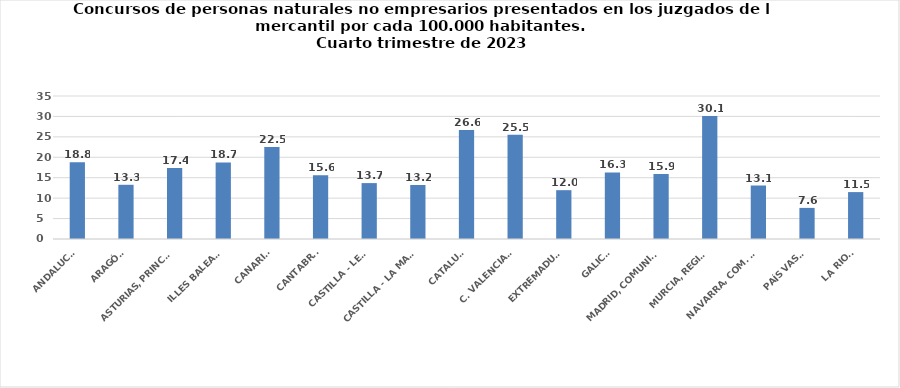
| Category | Series 0 |
|---|---|
| ANDALUCÍA | 18.776 |
| ARAGÓN | 13.266 |
| ASTURIAS, PRINCIPADO | 17.385 |
| ILLES BALEARS | 18.728 |
| CANARIAS | 22.504 |
| CANTABRIA | 15.632 |
| CASTILLA - LEÓN | 13.683 |
| CASTILLA - LA MANCHA | 13.217 |
| CATALUÑA | 26.649 |
| C. VALENCIANA | 25.487 |
| EXTREMADURA | 11.951 |
| GALICIA | 16.298 |
| MADRID, COMUNIDAD | 15.929 |
| MURCIA, REGIÓN | 30.077 |
| NAVARRA, COM. FORAL | 13.091 |
| PAÍS VASCO | 7.613 |
| LA RIOJA | 11.481 |